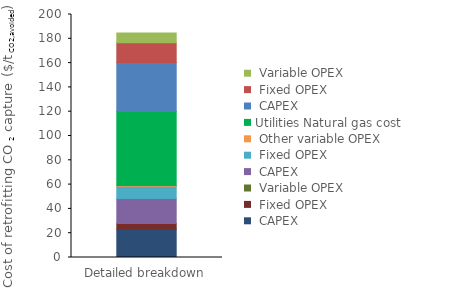
| Category | Interconnecting | Utilities | Series 0 | Series 1 | Series 2 |
|---|---|---|---|---|---|
| 0 | 0 | 60.842 | 40.417 | 16.228 | 8.148 |